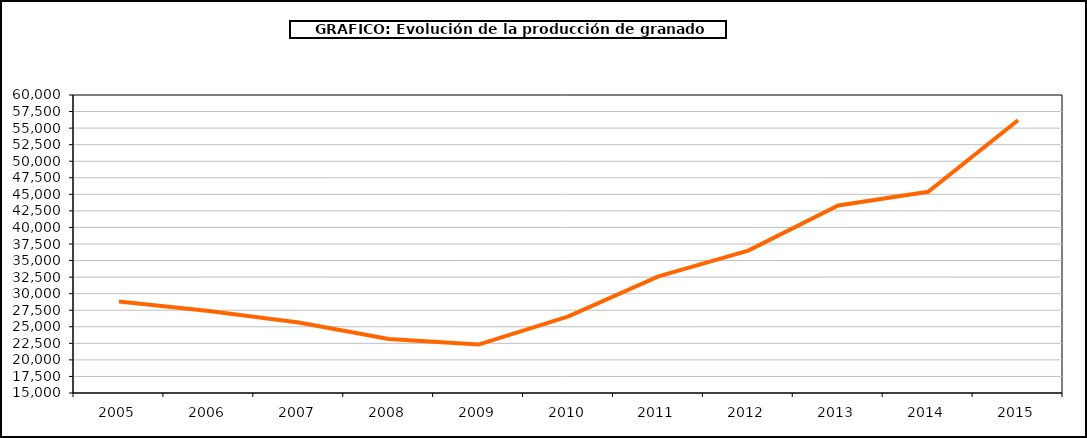
| Category | producción granado |
|---|---|
| 2005.0 | 28812 |
| 2006.0 | 27389 |
| 2007.0 | 25632 |
| 2008.0 | 23169 |
| 2009.0 | 22311 |
| 2010.0 | 26582 |
| 2011.0 | 32606 |
| 2012.0 | 36495 |
| 2013.0 | 43324 |
| 2014.0 | 45382 |
| 2015.0 | 56185 |